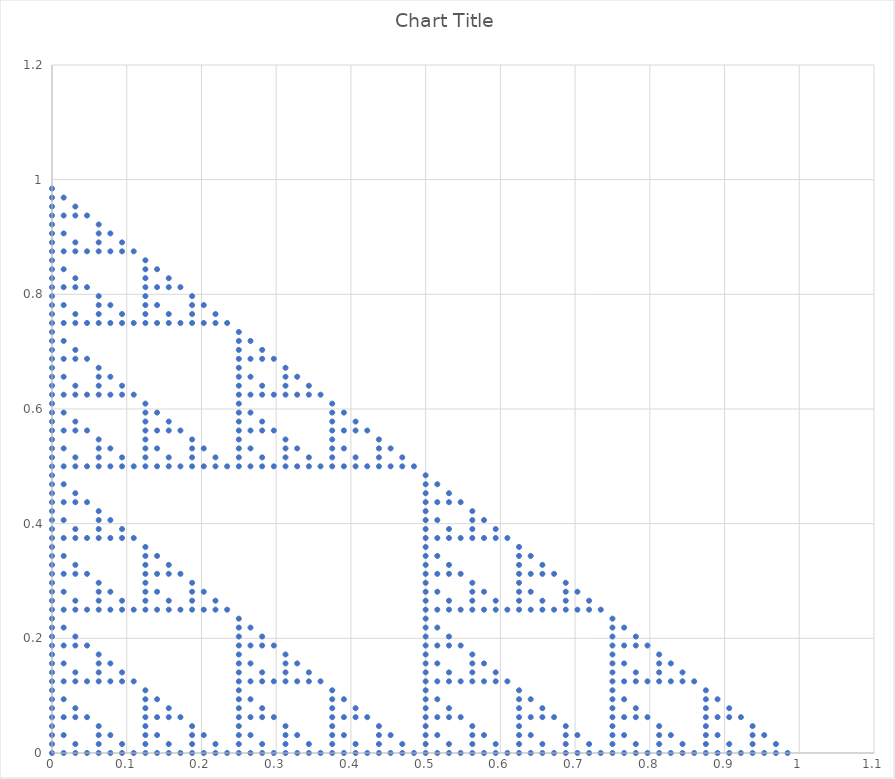
| Category | Series 0 |
|---|---|
| 0.0 | 0 |
| 0.015625 | 0 |
| 0.0 | 0.016 |
| 0.03125 | 0 |
| 0.046875 | 0 |
| 0.03125 | 0.016 |
| 0.0 | 0.031 |
| 0.015625 | 0.031 |
| 0.0 | 0.047 |
| 0.0625 | 0 |
| 0.078125 | 0 |
| 0.0625 | 0.016 |
| 0.09375 | 0 |
| 0.109375 | 0 |
| 0.09375 | 0.016 |
| 0.0625 | 0.031 |
| 0.078125 | 0.031 |
| 0.0625 | 0.047 |
| 0.0 | 0.062 |
| 0.015625 | 0.062 |
| 0.0 | 0.078 |
| 0.03125 | 0.062 |
| 0.046875 | 0.062 |
| 0.03125 | 0.078 |
| 0.0 | 0.094 |
| 0.015625 | 0.094 |
| 0.0 | 0.109 |
| 0.125 | 0 |
| 0.140625 | 0 |
| 0.125 | 0.016 |
| 0.15625 | 0 |
| 0.171875 | 0 |
| 0.15625 | 0.016 |
| 0.125 | 0.031 |
| 0.140625 | 0.031 |
| 0.125 | 0.047 |
| 0.1875 | 0 |
| 0.203125 | 0 |
| 0.1875 | 0.016 |
| 0.21875 | 0 |
| 0.234375 | 0 |
| 0.21875 | 0.016 |
| 0.1875 | 0.031 |
| 0.203125 | 0.031 |
| 0.1875 | 0.047 |
| 0.125 | 0.062 |
| 0.140625 | 0.062 |
| 0.125 | 0.078 |
| 0.15625 | 0.062 |
| 0.171875 | 0.062 |
| 0.15625 | 0.078 |
| 0.125 | 0.094 |
| 0.140625 | 0.094 |
| 0.125 | 0.109 |
| 0.0 | 0.125 |
| 0.015625 | 0.125 |
| 0.0 | 0.141 |
| 0.03125 | 0.125 |
| 0.046875 | 0.125 |
| 0.03125 | 0.141 |
| 0.0 | 0.156 |
| 0.015625 | 0.156 |
| 0.0 | 0.172 |
| 0.0625 | 0.125 |
| 0.078125 | 0.125 |
| 0.0625 | 0.141 |
| 0.09375 | 0.125 |
| 0.109375 | 0.125 |
| 0.09375 | 0.141 |
| 0.0625 | 0.156 |
| 0.078125 | 0.156 |
| 0.0625 | 0.172 |
| 0.0 | 0.188 |
| 0.015625 | 0.188 |
| 0.0 | 0.203 |
| 0.03125 | 0.188 |
| 0.046875 | 0.188 |
| 0.03125 | 0.203 |
| 0.0 | 0.219 |
| 0.015625 | 0.219 |
| 0.0 | 0.234 |
| 0.25 | 0 |
| 0.265625 | 0 |
| 0.25 | 0.016 |
| 0.28125 | 0 |
| 0.296875 | 0 |
| 0.28125 | 0.016 |
| 0.25 | 0.031 |
| 0.265625 | 0.031 |
| 0.25 | 0.047 |
| 0.3125 | 0 |
| 0.328125 | 0 |
| 0.3125 | 0.016 |
| 0.34375 | 0 |
| 0.359375 | 0 |
| 0.34375 | 0.016 |
| 0.3125 | 0.031 |
| 0.328125 | 0.031 |
| 0.3125 | 0.047 |
| 0.25 | 0.062 |
| 0.265625 | 0.062 |
| 0.25 | 0.078 |
| 0.28125 | 0.062 |
| 0.296875 | 0.062 |
| 0.28125 | 0.078 |
| 0.25 | 0.094 |
| 0.265625 | 0.094 |
| 0.25 | 0.109 |
| 0.375 | 0 |
| 0.390625 | 0 |
| 0.375 | 0.016 |
| 0.40625 | 0 |
| 0.421875 | 0 |
| 0.40625 | 0.016 |
| 0.375 | 0.031 |
| 0.390625 | 0.031 |
| 0.375 | 0.047 |
| 0.4375 | 0 |
| 0.453125 | 0 |
| 0.4375 | 0.016 |
| 0.46875 | 0 |
| 0.484375 | 0 |
| 0.46875 | 0.016 |
| 0.4375 | 0.031 |
| 0.453125 | 0.031 |
| 0.4375 | 0.047 |
| 0.375 | 0.062 |
| 0.390625 | 0.062 |
| 0.375 | 0.078 |
| 0.40625 | 0.062 |
| 0.421875 | 0.062 |
| 0.40625 | 0.078 |
| 0.375 | 0.094 |
| 0.390625 | 0.094 |
| 0.375 | 0.109 |
| 0.25 | 0.125 |
| 0.265625 | 0.125 |
| 0.25 | 0.141 |
| 0.28125 | 0.125 |
| 0.296875 | 0.125 |
| 0.28125 | 0.141 |
| 0.25 | 0.156 |
| 0.265625 | 0.156 |
| 0.25 | 0.172 |
| 0.3125 | 0.125 |
| 0.328125 | 0.125 |
| 0.3125 | 0.141 |
| 0.34375 | 0.125 |
| 0.359375 | 0.125 |
| 0.34375 | 0.141 |
| 0.3125 | 0.156 |
| 0.328125 | 0.156 |
| 0.3125 | 0.172 |
| 0.25 | 0.188 |
| 0.265625 | 0.188 |
| 0.25 | 0.203 |
| 0.28125 | 0.188 |
| 0.296875 | 0.188 |
| 0.28125 | 0.203 |
| 0.25 | 0.219 |
| 0.265625 | 0.219 |
| 0.25 | 0.234 |
| 0.0 | 0.25 |
| 0.015625 | 0.25 |
| 0.0 | 0.266 |
| 0.03125 | 0.25 |
| 0.046875 | 0.25 |
| 0.03125 | 0.266 |
| 0.0 | 0.281 |
| 0.015625 | 0.281 |
| 0.0 | 0.297 |
| 0.0625 | 0.25 |
| 0.078125 | 0.25 |
| 0.0625 | 0.266 |
| 0.09375 | 0.25 |
| 0.109375 | 0.25 |
| 0.09375 | 0.266 |
| 0.0625 | 0.281 |
| 0.078125 | 0.281 |
| 0.0625 | 0.297 |
| 0.0 | 0.312 |
| 0.015625 | 0.312 |
| 0.0 | 0.328 |
| 0.03125 | 0.312 |
| 0.046875 | 0.312 |
| 0.03125 | 0.328 |
| 0.0 | 0.344 |
| 0.015625 | 0.344 |
| 0.0 | 0.359 |
| 0.125 | 0.25 |
| 0.140625 | 0.25 |
| 0.125 | 0.266 |
| 0.15625 | 0.25 |
| 0.171875 | 0.25 |
| 0.15625 | 0.266 |
| 0.125 | 0.281 |
| 0.140625 | 0.281 |
| 0.125 | 0.297 |
| 0.1875 | 0.25 |
| 0.203125 | 0.25 |
| 0.1875 | 0.266 |
| 0.21875 | 0.25 |
| 0.234375 | 0.25 |
| 0.21875 | 0.266 |
| 0.1875 | 0.281 |
| 0.203125 | 0.281 |
| 0.1875 | 0.297 |
| 0.125 | 0.312 |
| 0.140625 | 0.312 |
| 0.125 | 0.328 |
| 0.15625 | 0.312 |
| 0.171875 | 0.312 |
| 0.15625 | 0.328 |
| 0.125 | 0.344 |
| 0.140625 | 0.344 |
| 0.125 | 0.359 |
| 0.0 | 0.375 |
| 0.015625 | 0.375 |
| 0.0 | 0.391 |
| 0.03125 | 0.375 |
| 0.046875 | 0.375 |
| 0.03125 | 0.391 |
| 0.0 | 0.406 |
| 0.015625 | 0.406 |
| 0.0 | 0.422 |
| 0.0625 | 0.375 |
| 0.078125 | 0.375 |
| 0.0625 | 0.391 |
| 0.09375 | 0.375 |
| 0.109375 | 0.375 |
| 0.09375 | 0.391 |
| 0.0625 | 0.406 |
| 0.078125 | 0.406 |
| 0.0625 | 0.422 |
| 0.0 | 0.438 |
| 0.015625 | 0.438 |
| 0.0 | 0.453 |
| 0.03125 | 0.438 |
| 0.046875 | 0.438 |
| 0.03125 | 0.453 |
| 0.0 | 0.469 |
| 0.015625 | 0.469 |
| 0.0 | 0.484 |
| 0.5 | 0 |
| 0.515625 | 0 |
| 0.5 | 0.016 |
| 0.53125 | 0 |
| 0.546875 | 0 |
| 0.53125 | 0.016 |
| 0.5 | 0.031 |
| 0.515625 | 0.031 |
| 0.5 | 0.047 |
| 0.5625 | 0 |
| 0.578125 | 0 |
| 0.5625 | 0.016 |
| 0.59375 | 0 |
| 0.609375 | 0 |
| 0.59375 | 0.016 |
| 0.5625 | 0.031 |
| 0.578125 | 0.031 |
| 0.5625 | 0.047 |
| 0.5 | 0.062 |
| 0.515625 | 0.062 |
| 0.5 | 0.078 |
| 0.53125 | 0.062 |
| 0.546875 | 0.062 |
| 0.53125 | 0.078 |
| 0.5 | 0.094 |
| 0.515625 | 0.094 |
| 0.5 | 0.109 |
| 0.625 | 0 |
| 0.640625 | 0 |
| 0.625 | 0.016 |
| 0.65625 | 0 |
| 0.671875 | 0 |
| 0.65625 | 0.016 |
| 0.625 | 0.031 |
| 0.640625 | 0.031 |
| 0.625 | 0.047 |
| 0.6875 | 0 |
| 0.703125 | 0 |
| 0.6875 | 0.016 |
| 0.71875 | 0 |
| 0.734375 | 0 |
| 0.71875 | 0.016 |
| 0.6875 | 0.031 |
| 0.703125 | 0.031 |
| 0.6875 | 0.047 |
| 0.625 | 0.062 |
| 0.640625 | 0.062 |
| 0.625 | 0.078 |
| 0.65625 | 0.062 |
| 0.671875 | 0.062 |
| 0.65625 | 0.078 |
| 0.625 | 0.094 |
| 0.640625 | 0.094 |
| 0.625 | 0.109 |
| 0.5 | 0.125 |
| 0.515625 | 0.125 |
| 0.5 | 0.141 |
| 0.53125 | 0.125 |
| 0.546875 | 0.125 |
| 0.53125 | 0.141 |
| 0.5 | 0.156 |
| 0.515625 | 0.156 |
| 0.5 | 0.172 |
| 0.5625 | 0.125 |
| 0.578125 | 0.125 |
| 0.5625 | 0.141 |
| 0.59375 | 0.125 |
| 0.609375 | 0.125 |
| 0.59375 | 0.141 |
| 0.5625 | 0.156 |
| 0.578125 | 0.156 |
| 0.5625 | 0.172 |
| 0.5 | 0.188 |
| 0.515625 | 0.188 |
| 0.5 | 0.203 |
| 0.53125 | 0.188 |
| 0.546875 | 0.188 |
| 0.53125 | 0.203 |
| 0.5 | 0.219 |
| 0.515625 | 0.219 |
| 0.5 | 0.234 |
| 0.75 | 0 |
| 0.765625 | 0 |
| 0.75 | 0.016 |
| 0.78125 | 0 |
| 0.796875 | 0 |
| 0.78125 | 0.016 |
| 0.75 | 0.031 |
| 0.765625 | 0.031 |
| 0.75 | 0.047 |
| 0.8125 | 0 |
| 0.828125 | 0 |
| 0.8125 | 0.016 |
| 0.84375 | 0 |
| 0.859375 | 0 |
| 0.84375 | 0.016 |
| 0.8125 | 0.031 |
| 0.828125 | 0.031 |
| 0.8125 | 0.047 |
| 0.75 | 0.062 |
| 0.765625 | 0.062 |
| 0.75 | 0.078 |
| 0.78125 | 0.062 |
| 0.796875 | 0.062 |
| 0.78125 | 0.078 |
| 0.75 | 0.094 |
| 0.765625 | 0.094 |
| 0.75 | 0.109 |
| 0.875 | 0 |
| 0.890625 | 0 |
| 0.875 | 0.016 |
| 0.90625 | 0 |
| 0.921875 | 0 |
| 0.90625 | 0.016 |
| 0.875 | 0.031 |
| 0.890625 | 0.031 |
| 0.875 | 0.047 |
| 0.9375 | 0 |
| 0.953125 | 0 |
| 0.9375 | 0.016 |
| 0.96875 | 0 |
| 0.984375 | 0 |
| 0.96875 | 0.016 |
| 0.9375 | 0.031 |
| 0.953125 | 0.031 |
| 0.9375 | 0.047 |
| 0.875 | 0.062 |
| 0.890625 | 0.062 |
| 0.875 | 0.078 |
| 0.90625 | 0.062 |
| 0.921875 | 0.062 |
| 0.90625 | 0.078 |
| 0.875 | 0.094 |
| 0.890625 | 0.094 |
| 0.875 | 0.109 |
| 0.75 | 0.125 |
| 0.765625 | 0.125 |
| 0.75 | 0.141 |
| 0.78125 | 0.125 |
| 0.796875 | 0.125 |
| 0.78125 | 0.141 |
| 0.75 | 0.156 |
| 0.765625 | 0.156 |
| 0.75 | 0.172 |
| 0.8125 | 0.125 |
| 0.828125 | 0.125 |
| 0.8125 | 0.141 |
| 0.84375 | 0.125 |
| 0.859375 | 0.125 |
| 0.84375 | 0.141 |
| 0.8125 | 0.156 |
| 0.828125 | 0.156 |
| 0.8125 | 0.172 |
| 0.75 | 0.188 |
| 0.765625 | 0.188 |
| 0.75 | 0.203 |
| 0.78125 | 0.188 |
| 0.796875 | 0.188 |
| 0.78125 | 0.203 |
| 0.75 | 0.219 |
| 0.765625 | 0.219 |
| 0.75 | 0.234 |
| 0.5 | 0.25 |
| 0.515625 | 0.25 |
| 0.5 | 0.266 |
| 0.53125 | 0.25 |
| 0.546875 | 0.25 |
| 0.53125 | 0.266 |
| 0.5 | 0.281 |
| 0.515625 | 0.281 |
| 0.5 | 0.297 |
| 0.5625 | 0.25 |
| 0.578125 | 0.25 |
| 0.5625 | 0.266 |
| 0.59375 | 0.25 |
| 0.609375 | 0.25 |
| 0.59375 | 0.266 |
| 0.5625 | 0.281 |
| 0.578125 | 0.281 |
| 0.5625 | 0.297 |
| 0.5 | 0.312 |
| 0.515625 | 0.312 |
| 0.5 | 0.328 |
| 0.53125 | 0.312 |
| 0.546875 | 0.312 |
| 0.53125 | 0.328 |
| 0.5 | 0.344 |
| 0.515625 | 0.344 |
| 0.5 | 0.359 |
| 0.625 | 0.25 |
| 0.640625 | 0.25 |
| 0.625 | 0.266 |
| 0.65625 | 0.25 |
| 0.671875 | 0.25 |
| 0.65625 | 0.266 |
| 0.625 | 0.281 |
| 0.640625 | 0.281 |
| 0.625 | 0.297 |
| 0.6875 | 0.25 |
| 0.703125 | 0.25 |
| 0.6875 | 0.266 |
| 0.71875 | 0.25 |
| 0.734375 | 0.25 |
| 0.71875 | 0.266 |
| 0.6875 | 0.281 |
| 0.703125 | 0.281 |
| 0.6875 | 0.297 |
| 0.625 | 0.312 |
| 0.640625 | 0.312 |
| 0.625 | 0.328 |
| 0.65625 | 0.312 |
| 0.671875 | 0.312 |
| 0.65625 | 0.328 |
| 0.625 | 0.344 |
| 0.640625 | 0.344 |
| 0.625 | 0.359 |
| 0.5 | 0.375 |
| 0.515625 | 0.375 |
| 0.5 | 0.391 |
| 0.53125 | 0.375 |
| 0.546875 | 0.375 |
| 0.53125 | 0.391 |
| 0.5 | 0.406 |
| 0.515625 | 0.406 |
| 0.5 | 0.422 |
| 0.5625 | 0.375 |
| 0.578125 | 0.375 |
| 0.5625 | 0.391 |
| 0.59375 | 0.375 |
| 0.609375 | 0.375 |
| 0.59375 | 0.391 |
| 0.5625 | 0.406 |
| 0.578125 | 0.406 |
| 0.5625 | 0.422 |
| 0.5 | 0.438 |
| 0.515625 | 0.438 |
| 0.5 | 0.453 |
| 0.53125 | 0.438 |
| 0.546875 | 0.438 |
| 0.53125 | 0.453 |
| 0.5 | 0.469 |
| 0.515625 | 0.469 |
| 0.5 | 0.484 |
| 0.0 | 0.5 |
| 0.015625 | 0.5 |
| 0.0 | 0.516 |
| 0.03125 | 0.5 |
| 0.046875 | 0.5 |
| 0.03125 | 0.516 |
| 0.0 | 0.531 |
| 0.015625 | 0.531 |
| 0.0 | 0.547 |
| 0.0625 | 0.5 |
| 0.078125 | 0.5 |
| 0.0625 | 0.516 |
| 0.09375 | 0.5 |
| 0.109375 | 0.5 |
| 0.09375 | 0.516 |
| 0.0625 | 0.531 |
| 0.078125 | 0.531 |
| 0.0625 | 0.547 |
| 0.0 | 0.562 |
| 0.015625 | 0.562 |
| 0.0 | 0.578 |
| 0.03125 | 0.562 |
| 0.046875 | 0.562 |
| 0.03125 | 0.578 |
| 0.0 | 0.594 |
| 0.015625 | 0.594 |
| 0.0 | 0.609 |
| 0.125 | 0.5 |
| 0.140625 | 0.5 |
| 0.125 | 0.516 |
| 0.15625 | 0.5 |
| 0.171875 | 0.5 |
| 0.15625 | 0.516 |
| 0.125 | 0.531 |
| 0.140625 | 0.531 |
| 0.125 | 0.547 |
| 0.1875 | 0.5 |
| 0.203125 | 0.5 |
| 0.1875 | 0.516 |
| 0.21875 | 0.5 |
| 0.234375 | 0.5 |
| 0.21875 | 0.516 |
| 0.1875 | 0.531 |
| 0.203125 | 0.531 |
| 0.1875 | 0.547 |
| 0.125 | 0.562 |
| 0.140625 | 0.562 |
| 0.125 | 0.578 |
| 0.15625 | 0.562 |
| 0.171875 | 0.562 |
| 0.15625 | 0.578 |
| 0.125 | 0.594 |
| 0.140625 | 0.594 |
| 0.125 | 0.609 |
| 0.0 | 0.625 |
| 0.015625 | 0.625 |
| 0.0 | 0.641 |
| 0.03125 | 0.625 |
| 0.046875 | 0.625 |
| 0.03125 | 0.641 |
| 0.0 | 0.656 |
| 0.015625 | 0.656 |
| 0.0 | 0.672 |
| 0.0625 | 0.625 |
| 0.078125 | 0.625 |
| 0.0625 | 0.641 |
| 0.09375 | 0.625 |
| 0.109375 | 0.625 |
| 0.09375 | 0.641 |
| 0.0625 | 0.656 |
| 0.078125 | 0.656 |
| 0.0625 | 0.672 |
| 0.0 | 0.688 |
| 0.015625 | 0.688 |
| 0.0 | 0.703 |
| 0.03125 | 0.688 |
| 0.046875 | 0.688 |
| 0.03125 | 0.703 |
| 0.0 | 0.719 |
| 0.015625 | 0.719 |
| 0.0 | 0.734 |
| 0.25 | 0.5 |
| 0.265625 | 0.5 |
| 0.25 | 0.516 |
| 0.28125 | 0.5 |
| 0.296875 | 0.5 |
| 0.28125 | 0.516 |
| 0.25 | 0.531 |
| 0.265625 | 0.531 |
| 0.25 | 0.547 |
| 0.3125 | 0.5 |
| 0.328125 | 0.5 |
| 0.3125 | 0.516 |
| 0.34375 | 0.5 |
| 0.359375 | 0.5 |
| 0.34375 | 0.516 |
| 0.3125 | 0.531 |
| 0.328125 | 0.531 |
| 0.3125 | 0.547 |
| 0.25 | 0.562 |
| 0.265625 | 0.562 |
| 0.25 | 0.578 |
| 0.28125 | 0.562 |
| 0.296875 | 0.562 |
| 0.28125 | 0.578 |
| 0.25 | 0.594 |
| 0.265625 | 0.594 |
| 0.25 | 0.609 |
| 0.375 | 0.5 |
| 0.390625 | 0.5 |
| 0.375 | 0.516 |
| 0.40625 | 0.5 |
| 0.421875 | 0.5 |
| 0.40625 | 0.516 |
| 0.375 | 0.531 |
| 0.390625 | 0.531 |
| 0.375 | 0.547 |
| 0.4375 | 0.5 |
| 0.453125 | 0.5 |
| 0.4375 | 0.516 |
| 0.46875 | 0.5 |
| 0.484375 | 0.5 |
| 0.46875 | 0.516 |
| 0.4375 | 0.531 |
| 0.453125 | 0.531 |
| 0.4375 | 0.547 |
| 0.375 | 0.562 |
| 0.390625 | 0.562 |
| 0.375 | 0.578 |
| 0.40625 | 0.562 |
| 0.421875 | 0.562 |
| 0.40625 | 0.578 |
| 0.375 | 0.594 |
| 0.390625 | 0.594 |
| 0.375 | 0.609 |
| 0.25 | 0.625 |
| 0.265625 | 0.625 |
| 0.25 | 0.641 |
| 0.28125 | 0.625 |
| 0.296875 | 0.625 |
| 0.28125 | 0.641 |
| 0.25 | 0.656 |
| 0.265625 | 0.656 |
| 0.25 | 0.672 |
| 0.3125 | 0.625 |
| 0.328125 | 0.625 |
| 0.3125 | 0.641 |
| 0.34375 | 0.625 |
| 0.359375 | 0.625 |
| 0.34375 | 0.641 |
| 0.3125 | 0.656 |
| 0.328125 | 0.656 |
| 0.3125 | 0.672 |
| 0.25 | 0.688 |
| 0.265625 | 0.688 |
| 0.25 | 0.703 |
| 0.28125 | 0.688 |
| 0.296875 | 0.688 |
| 0.28125 | 0.703 |
| 0.25 | 0.719 |
| 0.265625 | 0.719 |
| 0.25 | 0.734 |
| 0.0 | 0.75 |
| 0.015625 | 0.75 |
| 0.0 | 0.766 |
| 0.03125 | 0.75 |
| 0.046875 | 0.75 |
| 0.03125 | 0.766 |
| 0.0 | 0.781 |
| 0.015625 | 0.781 |
| 0.0 | 0.797 |
| 0.0625 | 0.75 |
| 0.078125 | 0.75 |
| 0.0625 | 0.766 |
| 0.09375 | 0.75 |
| 0.109375 | 0.75 |
| 0.09375 | 0.766 |
| 0.0625 | 0.781 |
| 0.078125 | 0.781 |
| 0.0625 | 0.797 |
| 0.0 | 0.812 |
| 0.015625 | 0.812 |
| 0.0 | 0.828 |
| 0.03125 | 0.812 |
| 0.046875 | 0.812 |
| 0.03125 | 0.828 |
| 0.0 | 0.844 |
| 0.015625 | 0.844 |
| 0.0 | 0.859 |
| 0.125 | 0.75 |
| 0.140625 | 0.75 |
| 0.125 | 0.766 |
| 0.15625 | 0.75 |
| 0.171875 | 0.75 |
| 0.15625 | 0.766 |
| 0.125 | 0.781 |
| 0.140625 | 0.781 |
| 0.125 | 0.797 |
| 0.1875 | 0.75 |
| 0.203125 | 0.75 |
| 0.1875 | 0.766 |
| 0.21875 | 0.75 |
| 0.234375 | 0.75 |
| 0.21875 | 0.766 |
| 0.1875 | 0.781 |
| 0.203125 | 0.781 |
| 0.1875 | 0.797 |
| 0.125 | 0.812 |
| 0.140625 | 0.812 |
| 0.125 | 0.828 |
| 0.15625 | 0.812 |
| 0.171875 | 0.812 |
| 0.15625 | 0.828 |
| 0.125 | 0.844 |
| 0.140625 | 0.844 |
| 0.125 | 0.859 |
| 0.0 | 0.875 |
| 0.015625 | 0.875 |
| 0.0 | 0.891 |
| 0.03125 | 0.875 |
| 0.046875 | 0.875 |
| 0.03125 | 0.891 |
| 0.0 | 0.906 |
| 0.015625 | 0.906 |
| 0.0 | 0.922 |
| 0.0625 | 0.875 |
| 0.078125 | 0.875 |
| 0.0625 | 0.891 |
| 0.09375 | 0.875 |
| 0.109375 | 0.875 |
| 0.09375 | 0.891 |
| 0.0625 | 0.906 |
| 0.078125 | 0.906 |
| 0.0625 | 0.922 |
| 0.0 | 0.938 |
| 0.015625 | 0.938 |
| 0.0 | 0.953 |
| 0.03125 | 0.938 |
| 0.046875 | 0.938 |
| 0.03125 | 0.953 |
| 0.0 | 0.969 |
| 0.015625 | 0.969 |
| 0.0 | 0.984 |